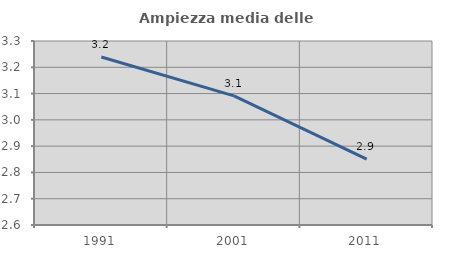
| Category | Ampiezza media delle famiglie |
|---|---|
| 1991.0 | 3.239 |
| 2001.0 | 3.091 |
| 2011.0 | 2.851 |